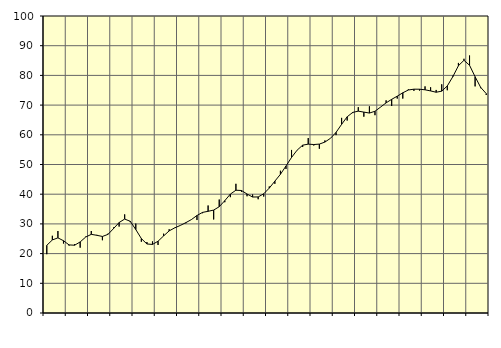
| Category | Piggar | Series 1 |
|---|---|---|
| nan | 19.8 | 22.79 |
| 1.0 | 26 | 24.59 |
| 1.0 | 27.6 | 25.3 |
| 1.0 | 23.4 | 24.34 |
| nan | 22.7 | 22.93 |
| 2.0 | 23.2 | 22.82 |
| 2.0 | 22 | 23.93 |
| 2.0 | 25.7 | 25.58 |
| nan | 27.6 | 26.48 |
| 3.0 | 26.3 | 26.16 |
| 3.0 | 24.5 | 25.77 |
| 3.0 | 26.7 | 26.47 |
| nan | 28.8 | 28.43 |
| 4.0 | 29.1 | 30.46 |
| 4.0 | 33.2 | 31.63 |
| 4.0 | 30.6 | 30.88 |
| nan | 30.1 | 28.1 |
| 5.0 | 24 | 25.06 |
| 5.0 | 23.9 | 23.24 |
| 5.0 | 24.1 | 23.09 |
| nan | 22.9 | 24.16 |
| 6.0 | 26.7 | 25.95 |
| 6.0 | 28.2 | 27.65 |
| 6.0 | 28.6 | 28.67 |
| nan | 29.5 | 29.48 |
| 7.0 | 30.2 | 30.42 |
| 7.0 | 31.4 | 31.45 |
| 7.0 | 31.3 | 32.83 |
| nan | 33.6 | 33.87 |
| 8.0 | 36.2 | 34.24 |
| 8.0 | 31.5 | 34.65 |
| 8.0 | 38.2 | 35.79 |
| nan | 37.3 | 37.82 |
| 9.0 | 39 | 40.04 |
| 9.0 | 43.5 | 41.34 |
| 9.0 | 40.8 | 41.25 |
| nan | 39.3 | 40.06 |
| 10.0 | 39.9 | 39.05 |
| 10.0 | 38.3 | 39.08 |
| 10.0 | 39.2 | 40.14 |
| nan | 42.6 | 42.06 |
| 11.0 | 43.5 | 44.39 |
| 11.0 | 47.9 | 46.7 |
| 11.0 | 48.5 | 49.49 |
| nan | 54.9 | 52.37 |
| 12.0 | 54.8 | 54.82 |
| 12.0 | 55.9 | 56.51 |
| 12.0 | 58.9 | 56.85 |
| nan | 56.4 | 56.72 |
| 13.0 | 55.3 | 56.87 |
| 13.0 | 58.1 | 57.55 |
| 13.0 | 58.8 | 58.82 |
| nan | 59.9 | 60.81 |
| 14.0 | 65.7 | 63.52 |
| 14.0 | 64.8 | 66.06 |
| 14.0 | 67.3 | 67.55 |
| nan | 69.3 | 67.96 |
| 15.0 | 66.1 | 67.64 |
| 15.0 | 69.6 | 67.32 |
| 15.0 | 66.6 | 67.92 |
| nan | 69.3 | 69.33 |
| 16.0 | 71.6 | 70.75 |
| 16.0 | 69.7 | 71.94 |
| 16.0 | 72.2 | 73 |
| nan | 72.2 | 74.14 |
| 17.0 | 75.3 | 75.08 |
| 17.0 | 74.8 | 75.36 |
| 17.0 | 74.9 | 75.35 |
| nan | 76.3 | 75.15 |
| 18.0 | 76 | 74.77 |
| 18.0 | 75.1 | 74.33 |
| 18.0 | 77 | 74.69 |
| nan | 75 | 76.45 |
| 19.0 | 79.9 | 79.58 |
| 19.0 | 84.2 | 83.25 |
| 19.0 | 85.6 | 85.09 |
| nan | 86.7 | 83.41 |
| 20.0 | 76.3 | 79.55 |
| 20.0 | 75.7 | 75.97 |
| 20.0 | 73.4 | 73.87 |